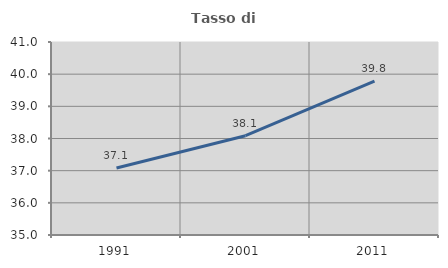
| Category | Tasso di occupazione   |
|---|---|
| 1991.0 | 37.084 |
| 2001.0 | 38.086 |
| 2011.0 | 39.784 |